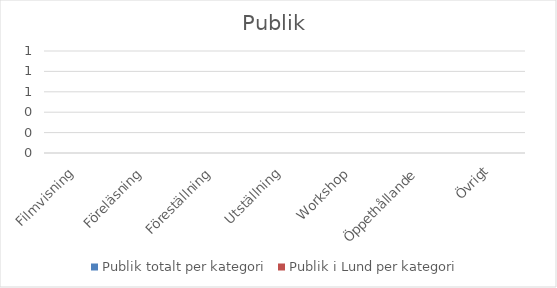
| Category | Publik totalt per kategori | Publik i Lund per kategori |
|---|---|---|
| Filmvisning | 0 | 0 |
| Föreläsning | 0 | 0 |
| Föreställning | 0 | 0 |
| Utställning | 0 | 0 |
| Workshop | 0 | 0 |
| Öppethållande | 0 | 0 |
| Övrigt | 0 | 0 |